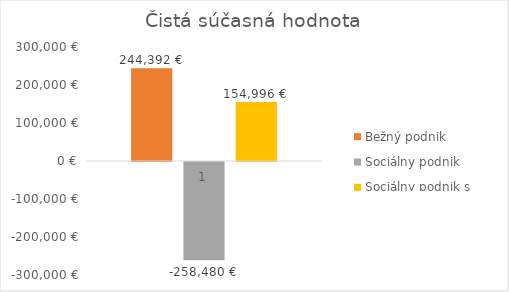
| Category | Bežný podnik | Sociálny podnik | Sociálny podnik s pomocou |
|---|---|---|---|
| 0 | 244392.36 | -258480.211 | 154996.141 |